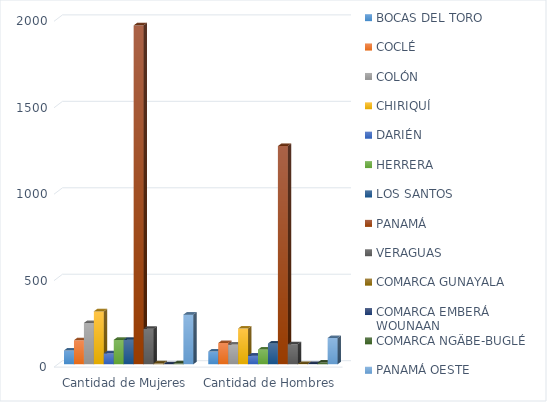
| Category | BOCAS DEL TORO | COCLÉ | COLÓN | CHIRIQUÍ | DARIÉN | HERRERA | LOS SANTOS | PANAMÁ | VERAGUAS | COMARCA GUNAYALA | COMARCA EMBERÁ WOUNAAN | COMARCA NGÄBE-BUGLÉ | PANAMÁ OESTE |
|---|---|---|---|---|---|---|---|---|---|---|---|---|---|
| Cantidad de Mujeres | 80 | 139 | 239 | 306 | 63 | 141 | 142 | 1960 | 205 | 5 | 0 | 5 | 287 |
| Cantidad de Hombres | 74 | 123 | 114 | 207 | 50 | 85 | 120 | 1262 | 116 | 1 | 1 | 10 | 152 |